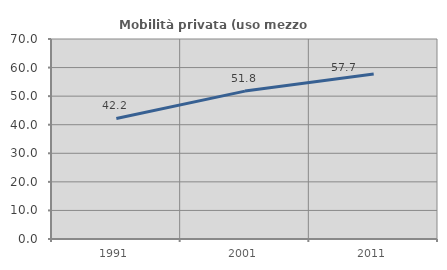
| Category | Mobilità privata (uso mezzo privato) |
|---|---|
| 1991.0 | 42.205 |
| 2001.0 | 51.763 |
| 2011.0 | 57.744 |